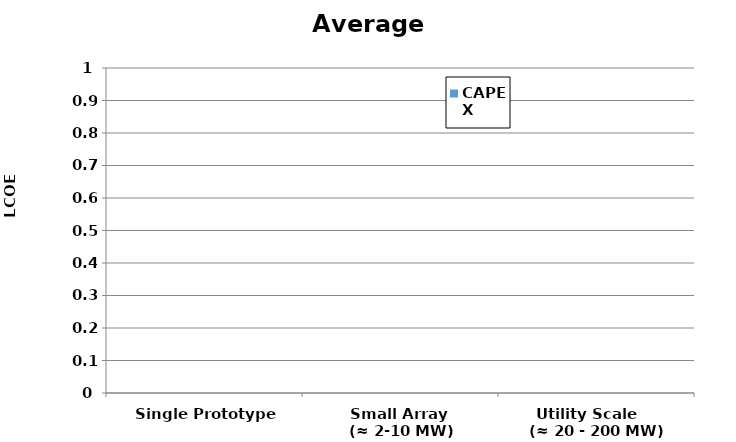
| Category | CAPEX |
|---|---|
| Single Prototype 
(≈ 0,1 - 2MW) | 0 |
| Small Array 
(≈ 2-10 MW) | 0 |
| Utility Scale    
(≈ 20 - 200 MW) | 0 |